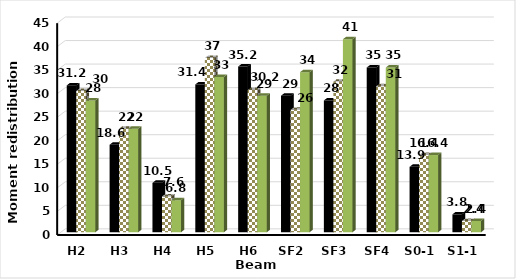
| Category | Experimental data | Analytical model | Prediction (typical strains) |
|---|---|---|---|
| H2 | 31.2 | 30 | 28 |
| H3 | 18.6 | 22 | 22 |
| H4 | 10.5 | 7.6 | 6.8 |
| H5 | 31.4 | 37 | 33 |
| H6 | 35.2 | 30.2 | 29 |
| SF2 | 29 | 26 | 34 |
| SF3 | 28 | 32 | 41 |
| SF4 | 35 | 31 | 35 |
| S0-1 | 13.9 | 16.4 | 16.4 |
| S1-1 | 3.8 | 2.4 | 2.4 |